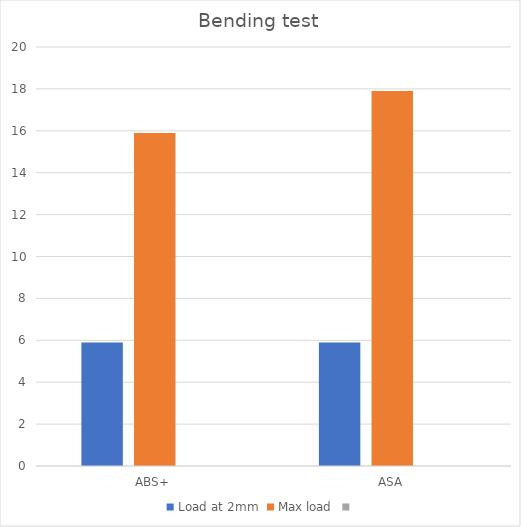
| Category | Load at 2mm | Max load | Series 2 |
|---|---|---|---|
| ABS+ | 5.9 | 15.9 |  |
| ASA | 5.9 | 17.9 |  |